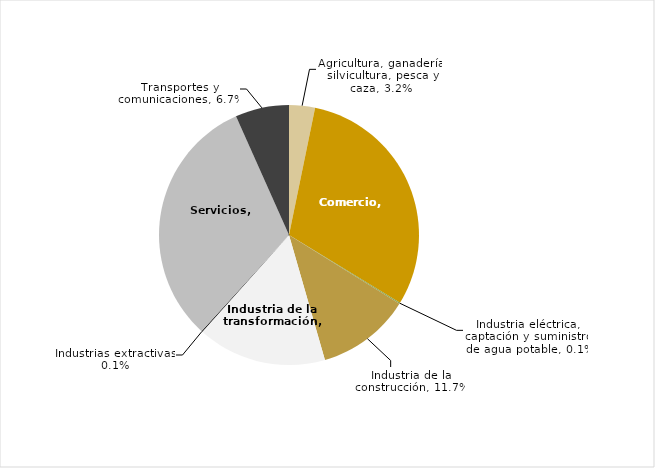
| Category | Series 0 |
|---|---|
| Agricultura, ganadería, silvicultura, pesca y caza | 0.032 |
| Comercio | 0.305 |
| Industria eléctrica, captación y suministro de agua potable | 0.001 |
| Industria de la construcción | 0.117 |
| Industria de la transformación | 0.161 |
| Industrias extractivas | 0.001 |
| Servicios | 0.316 |
| Transportes y comunicaciones | 0.067 |